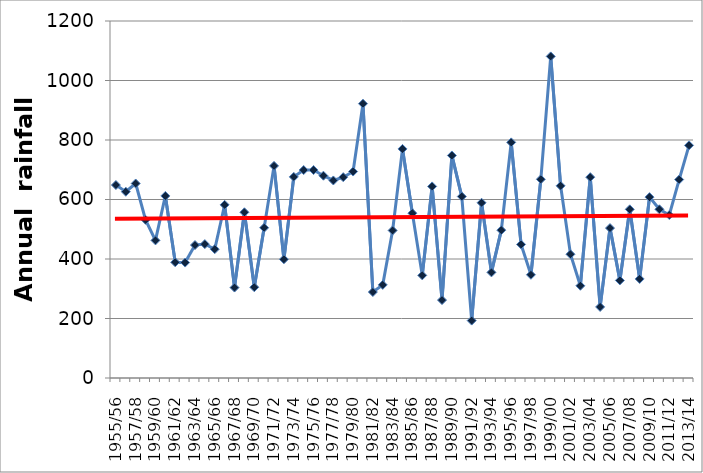
| Category | Series 0 |
|---|---|
| 1955/56 | 648.6 |
| 1956/57 | 626.1 |
| 1957/58 | 653.8 |
| 1958/59 | 531.6 |
| 1959/60 | 462.6 |
| 1960/61 | 612 |
| 1961/62 | 389 |
| 1962/63 | 388 |
| 1963/64 | 447 |
| 1964/65 | 450 |
| 1965/66 | 433 |
| 1966/67 | 582 |
| 1967/68 | 304 |
| 1968/69 | 557 |
| 1969/70 | 305 |
| 1970/71 | 505 |
| 1971/72 | 713 |
| 1972/73 | 399 |
| 1973/74 | 676 |
| 1974/75 | 699 |
| 1975/76 | 699 |
| 1976/77 | 680 |
| 1977/78 | 664 |
| 1978/79 | 675 |
| 1979/80 | 694 |
| 1980/81 | 922 |
| 1981/82 | 289 |
| 1982/83 | 313 |
| 1983/84 | 496 |
| 1984/85 | 770 |
| 1985/86 | 554 |
| 1986/87 | 345 |
| 1987/88 | 644 |
| 1988/89 | 262 |
| 1989/90 | 748 |
| 1990/91 | 610 |
| 1991/92 | 193 |
| 1992/93 | 589 |
| 1993/94 | 355 |
| 1994/95 | 497 |
| 1995/96 | 792 |
| 1996/97 | 449 |
| 1997/98 | 347 |
| 1998/99 | 668 |
| 1999/00 | 1081 |
| 2000/01 | 646 |
| 2001/02 | 416 |
| 2002/03 | 310 |
| 2003/04 | 675 |
| 2004/05 | 239 |
| 2005/06 | 504 |
| 2006/07 | 328 |
| 2007/08 | 567 |
| 2008/09 | 333 |
| 2009/10 | 608 |
| 2010/11 | 567 |
| 2011/12 | 548 |
| 2012/13 | 667 |
| 2013/14 | 782 |